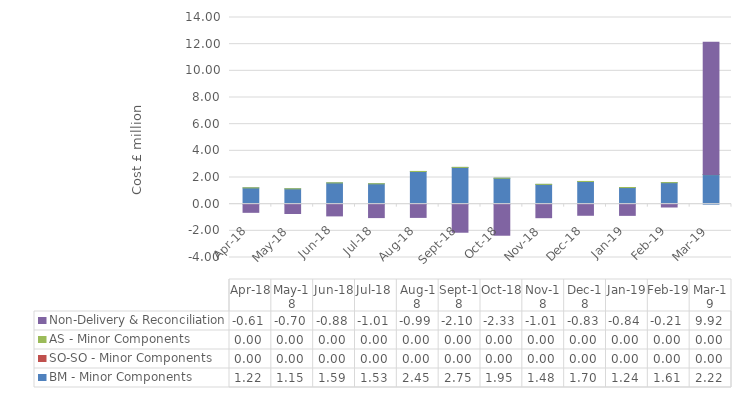
| Category | BM - Minor Components | SO-SO - Minor Components | AS - Minor Components | Non-Delivery & Reconciliation |
|---|---|---|---|---|
| 2018-04-30 | 1.22 | 0 | 0.005 | -0.612 |
| 2018-05-31 | 1.149 | 0 | 0.004 | -0.702 |
| 2018-06-30 | 1.595 | 0 | 0.004 | -0.88 |
| 2018-07-31 | 1.526 | 0 | 0.004 | -1.007 |
| 2018-08-31 | 2.451 | 0 | 0.004 | -0.993 |
| 2018-09-30 | 2.755 | 0 | 0.004 | -2.105 |
| 2018-10-31 | 1.945 | 0 | 0.004 | -2.33 |
| 2018-11-30 | 1.483 | 0 | 0.004 | -1.014 |
| 2018-12-31 | 1.7 | 0 | 0.005 | -0.833 |
| 2019-01-31 | 1.244 | 0 | 0.004 | -0.84 |
| 2019-02-28 | 1.612 | 0 | 0.004 | -0.213 |
| 2019-03-31 | 2.216 | 0 | 0.004 | 9.918 |